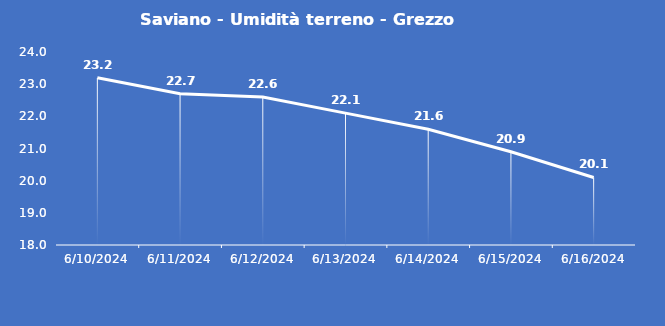
| Category | Saviano - Umidità terreno - Grezzo (%VWC) |
|---|---|
| 6/10/24 | 23.2 |
| 6/11/24 | 22.7 |
| 6/12/24 | 22.6 |
| 6/13/24 | 22.1 |
| 6/14/24 | 21.6 |
| 6/15/24 | 20.9 |
| 6/16/24 | 20.1 |